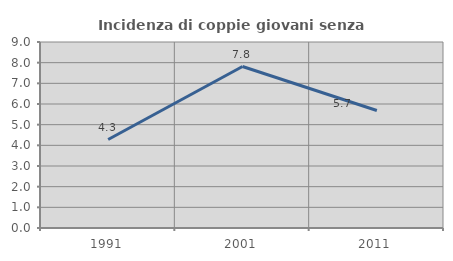
| Category | Incidenza di coppie giovani senza figli |
|---|---|
| 1991.0 | 4.282 |
| 2001.0 | 7.814 |
| 2011.0 | 5.684 |